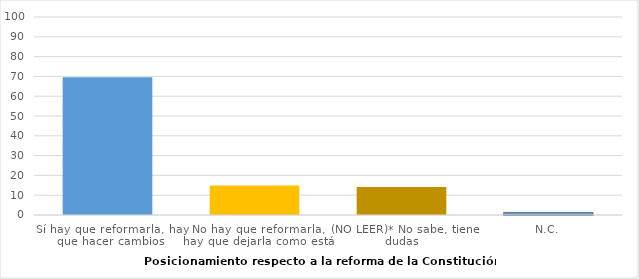
| Category | Series 0 |
|---|---|
| Sí hay que reformarla, hay que hacer cambios | 69.6 |
| No hay que reformarla, hay que dejarla como está | 14.9 |
| (NO LEER)* No sabe, tiene dudas | 14.2 |
| N.C. | 1.3 |